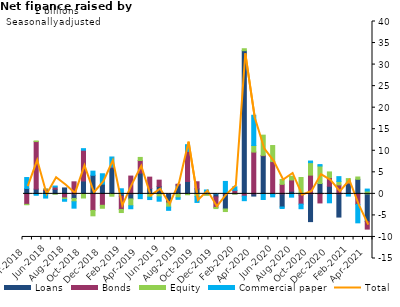
| Category | Loans | Bonds | Equity | Commercial paper |
|---|---|---|---|---|
| Apr-2018 | 1.259 | -2.435 | -0.091 | 2.532 |
| May-2018 | 1.109 | 11.031 | 0.137 | -0.33 |
| Jun-2018 | 0.809 | 0.294 | 0.025 | -0.977 |
| Jul-2018 | 1.09 | 0.494 | -0.066 | 0.233 |
| Aug-2018 | 1.373 | -0.932 | -0.354 | -0.431 |
| Sep-2018 | -1.06 | 2.795 | -0.777 | -1.484 |
| Oct-2018 | 2.988 | 7.138 | -0.963 | 0.363 |
| Nov-2018 | 4.315 | -3.846 | -1.25 | 0.958 |
| Dec-2018 | 2.258 | -2.65 | -0.692 | 2.407 |
| Jan-2019 | 6.083 | 0.161 | -0.541 | 2.312 |
| Feb-2019 | -0.544 | -3.084 | -0.708 | 1.181 |
| Mar-2019 | -1.183 | 4.131 | -1.586 | -0.683 |
| Apr-2019 | 4.818 | 2.92 | 0.721 | -1.109 |
| May-2019 | 1.262 | 2.622 | -0.761 | -0.561 |
| Jun-2019 | 1.747 | 1.437 | -0.7 | -1.001 |
| Jul-2019 | -1.833 | -0.281 | -0.969 | -0.742 |
| Aug-2019 | 2.064 | 0.174 | -0.911 | -0.357 |
| Sep-2019 | 2.882 | 6.981 | -0.207 | 1.548 |
| Oct-2019 | 1.156 | 1.651 | -0.572 | -1.416 |
| Nov-2019 | 0.248 | -0.195 | -0.134 | 0.654 |
| Dec-2019 | -0.719 | -2.415 | -0.28 | 0.031 |
| Jan-2020 | -3.509 | 0.155 | -0.594 | 2.731 |
| Feb-2020 | 0.057 | 0.764 | -0.048 | 0.826 |
| Mar-2020 | 33.226 | -0.54 | 0.454 | -1.041 |
| Apr-2020 | -0.51 | 9.698 | 1.528 | 7.014 |
| May-2020 | 8.801 | 0.131 | 4.691 | -1.303 |
| Jun-2020 | -0.133 | 7.494 | 3.722 | -0.564 |
| Jul-2020 | -3.052 | 2.212 | 1.123 | -0.34 |
| Aug-2020 | 0.616 | 2.614 | 0.849 | -0.762 |
| Sep-2020 | -0.266 | -2.122 | 3.796 | -1.058 |
| Oct-2020 | -6.44 | 4.349 | 2.902 | 0.366 |
| Nov-2020 | 2.409 | -2.106 | 4.059 | 0.327 |
| Dec-2020 | 1.768 | 2.015 | 1.311 | -2.076 |
| Jan-2021 | -5.385 | 2.081 | 0.804 | 1.11 |
| Feb-2021 | 2.363 | 0.193 | 0.984 | -0.517 |
| Mar-2021 | 3.375 | -2.452 | 0.539 | -4.272 |
| Apr-2021 | -6.423 | -1.754 | 0.663 | 0.45 |